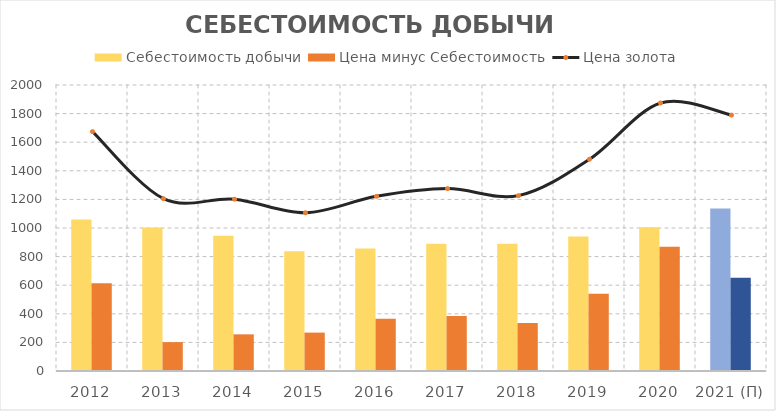
| Category | Себестоимость добычи | Цена минус Себестоимость |
|---|---|---|
| 2012 | 1060 | 614 |
| 2013 | 1003 | 202 |
| 2014 | 945 | 256.4 |
| 2015 | 838 | 268.45 |
| 2016 | 857 | 364.55 |
| 2017 | 890 | 385.42 |
| 2018 | 890 | 336.28 |
| 2019 | 940 | 540.96 |
| 2020 | 1005 | 869.23 |
| 2021 (П) | 1137 | 652.52 |